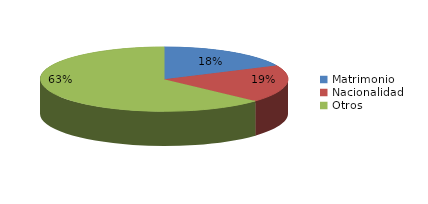
| Category | Series 0 |
|---|---|
| Matrimonio | 2432 |
| Nacionalidad | 2542 |
| Otros | 8527 |